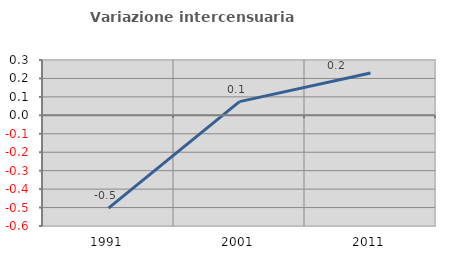
| Category | Variazione intercensuaria annua |
|---|---|
| 1991.0 | -0.503 |
| 2001.0 | 0.074 |
| 2011.0 | 0.23 |